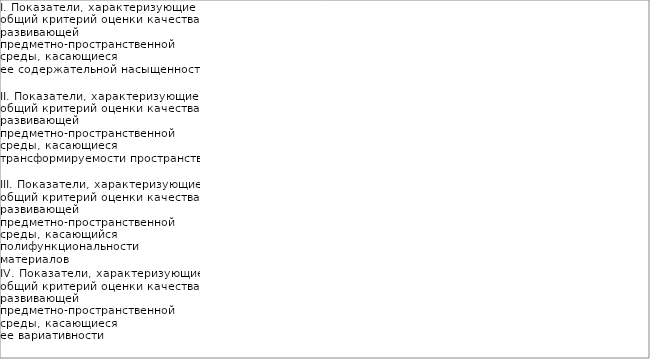
| Category | I. Показатели, характеризующие общий критерий оценки качества развивающей предметно-пространственной среды, касающиеся ее содержательной насыщенности | II. Показатели, характеризующие общий критерий оценки качества развивающей предметно-пространственной среды, касающиеся трансформируемости пространства | III. Показатели, характеризующие общий критерий оценки качества развивающей предметно-пространственной среды, касающийся полифункциональности материалов | IV. Показатели, характеризующие общий критерий оценки качества развивающей предметно-пространственной среды, касающиеся ее вариативности | V. Показатели, характеризующие общий критерий оценки качества развивающей предметно-пространственной среды, касающиеся ее доступности | VI. Показатели, характеризующие общий критерий оценки качества развивающей предметно-пространственной среды, касающиеся безопасности предметно-пространственной среды |
|---|---|---|---|---|---|---|
| Итог | 0.936 | 0.799 | 0.743 | 0.917 | 0.965 | 0.906 |